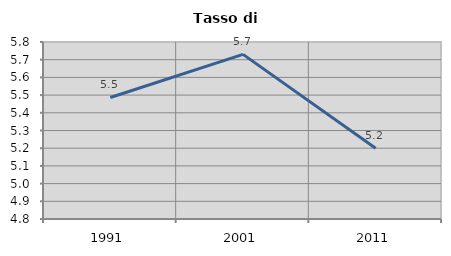
| Category | Tasso di disoccupazione   |
|---|---|
| 1991.0 | 5.487 |
| 2001.0 | 5.73 |
| 2011.0 | 5.199 |